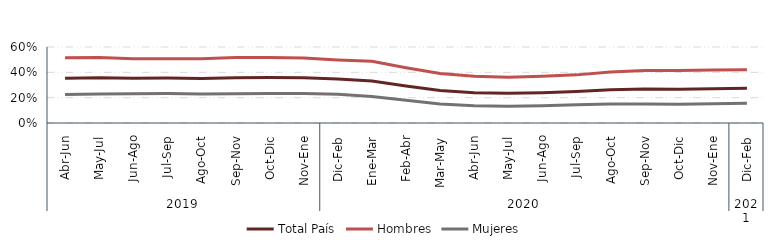
| Category | Total País | Hombres | Mujeres |
|---|---|---|---|
| 0 | 0.354 | 0.515 | 0.225 |
| 1 | 0.357 | 0.517 | 0.23 |
| 2 | 0.354 | 0.508 | 0.231 |
| 3 | 0.354 | 0.508 | 0.232 |
| 4 | 0.352 | 0.507 | 0.229 |
| 5 | 0.357 | 0.517 | 0.23 |
| 6 | 0.359 | 0.518 | 0.233 |
| 7 | 0.357 | 0.514 | 0.233 |
| 8 | 0.347 | 0.497 | 0.227 |
| 9 | 0.332 | 0.487 | 0.209 |
| 10 | 0.293 | 0.436 | 0.179 |
| 11 | 0.257 | 0.391 | 0.15 |
| 12 | 0.24 | 0.369 | 0.136 |
| 13 | 0.234 | 0.36 | 0.133 |
| 14 | 0.24 | 0.37 | 0.136 |
| 15 | 0.249 | 0.38 | 0.144 |
| 16 | 0.262 | 0.402 | 0.149 |
| 17 | 0.268 | 0.414 | 0.151 |
| 18 | 0.267 | 0.415 | 0.148 |
| 19 | 0.27 | 0.418 | 0.152 |
| 20 | 0.274 | 0.421 | 0.156 |